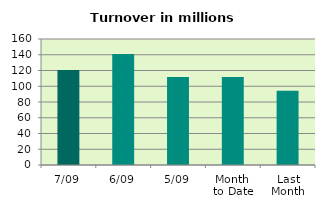
| Category | Series 0 |
|---|---|
| 7/09 | 120.506 |
| 6/09 | 140.926 |
| 5/09 | 111.899 |
| Month 
to Date | 111.78 |
| Last
Month | 94.334 |